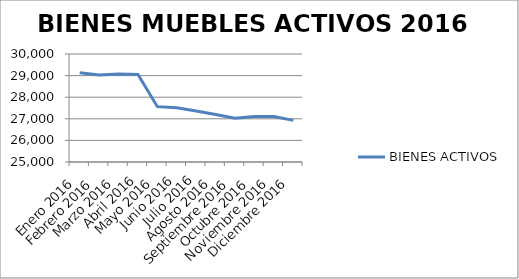
| Category | BIENES ACTIVOS |
|---|---|
| Enero 2016 | 29133 |
| Febrero 2016 | 29031 |
| Marzo 2016 | 29076 |
| Abril 2016 | 29048 |
| Mayo 2016 | 27562 |
| Junio 2016 | 27511 |
| Julio 2016 | 27365 |
| Agosto 2016 | 27197 |
| Septiembre 2016 | 27021 |
| Octubre 2016 | 27110 |
| Noviembre 2016 | 27106 |
| Diciembre 2016 | 26928 |